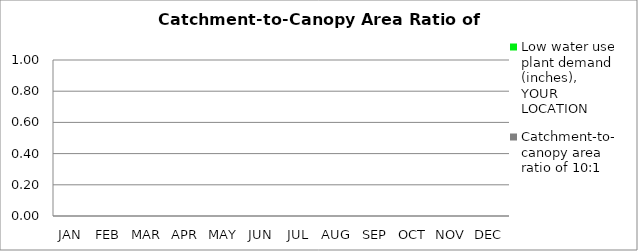
| Category | Low water use plant demand (inches), YOUR LOCATION | Catchment-to-canopy area ratio of 10:1  |
|---|---|---|
| JAN | 0 | 0 |
| FEB | 0 | 0 |
| MAR | 0 | 0 |
| APR | 0 | 0 |
| MAY | 0 | 0 |
| JUN | 0 | 0 |
| JUL | 0 | 0 |
| AUG | 0 | 0 |
| SEP | 0 | 0 |
| OCT | 0 | 0 |
| NOV | 0 | 0 |
| DEC | 0 | 0 |